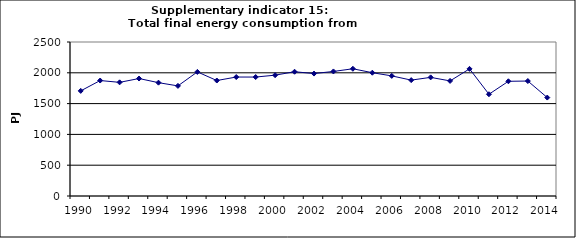
| Category | Total final energy consumption from households, PJ |
|---|---|
| 1990 | 1706.351 |
| 1991 | 1874.334 |
| 1992 | 1844.968 |
| 1993 | 1907.029 |
| 1994 | 1839.956 |
| 1995 | 1787.374 |
| 1996 | 2014.683 |
| 1997 | 1874.656 |
| 1998 | 1931.199 |
| 1999 | 1930.987 |
| 2000 | 1961.565 |
| 2001 | 2017.13 |
| 2002 | 1987.5 |
| 2003 | 2021.932 |
| 2004 | 2065.466 |
| 2005 | 2001.517 |
| 2006 | 1950.008 |
| 2007 | 1881.231 |
| 2008 | 1925.841 |
| 2009 | 1868.341 |
| 2010 | 2063.846 |
| 2011 | 1651.987 |
| 2012 | 1862.13 |
| 2013 | 1866.366 |
| 2014 | 1597.76 |